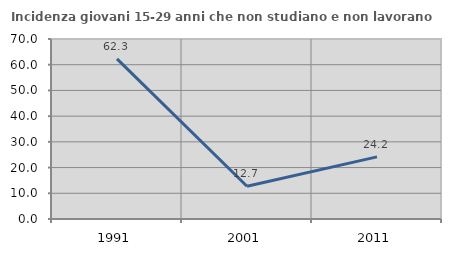
| Category | Incidenza giovani 15-29 anni che non studiano e non lavorano  |
|---|---|
| 1991.0 | 62.29 |
| 2001.0 | 12.736 |
| 2011.0 | 24.161 |